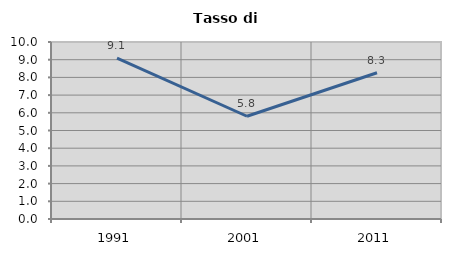
| Category | Tasso di disoccupazione   |
|---|---|
| 1991.0 | 9.091 |
| 2001.0 | 5.805 |
| 2011.0 | 8.261 |